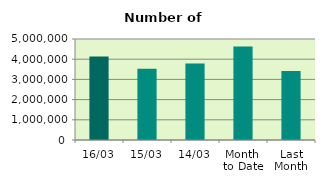
| Category | Series 0 |
|---|---|
| 16/03 | 4131916 |
| 15/03 | 3532970 |
| 14/03 | 3784668 |
| Month 
to Date | 4627967.5 |
| Last
Month | 3413232.3 |